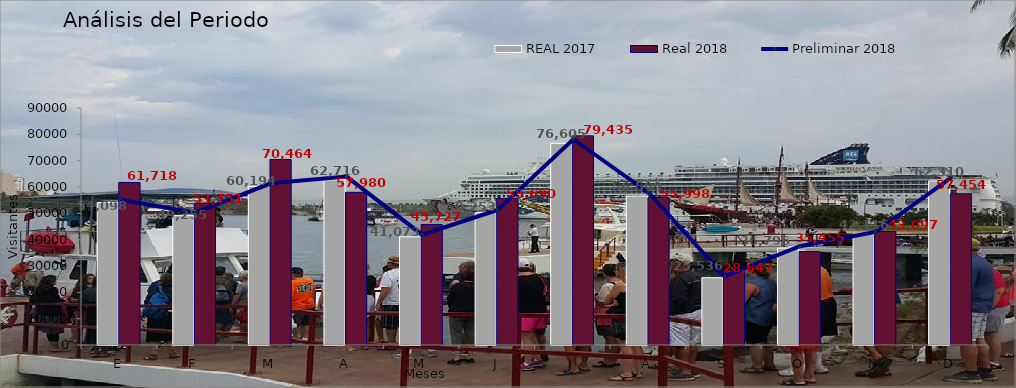
| Category | REAL 2017 | Real 2018 |
|---|---|---|
| E | 54098 | 61718 |
| F | 49255 | 53751 |
| M | 60194 | 70464 |
| A | 62716 | 57980 |
| M | 41073 | 45727 |
| J | 50253 | 55690 |
| J | 76605 | 79435 |
| A | 56599 | 55998 |
| S | 25536 | 28647 |
| O | 36796 | 35455 |
| N | 42116 | 43097 |
| D | 62310 | 57454 |